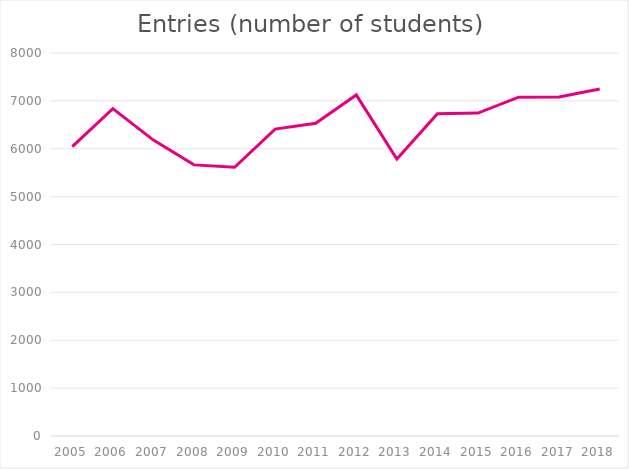
| Category | Number of geography students |
|---|---|
| 2005.0 | 6043 |
| 2006.0 | 6837 |
| 2007.0 | 6181 |
| 2008.0 | 5663 |
| 2009.0 | 5614 |
| 2010.0 | 6411 |
| 2011.0 | 6533 |
| 2012.0 | 7124 |
| 2013.0 | 5787 |
| 2014.0 | 6730 |
| 2015.0 | 6745 |
| 2016.0 | 7078 |
| 2017.0 | 7081 |
| 2018.0 | 7247 |